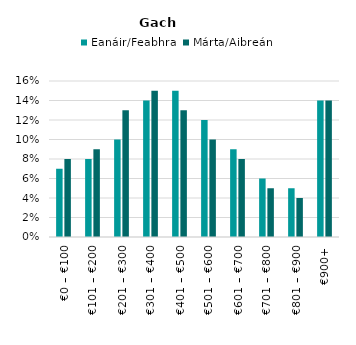
| Category | Eanáir/Feabhra | Márta/Aibreán |
|---|---|---|
| €0 – €100 | 0.07 | 0.08 |
| €101 – €200 | 0.08 | 0.09 |
| €201 – €300 | 0.1 | 0.13 |
| €301 – €400 | 0.14 | 0.15 |
| €401 – €500 | 0.15 | 0.13 |
| €501 – €600 | 0.12 | 0.1 |
| €601 – €700 | 0.09 | 0.08 |
| €701 – €800 | 0.06 | 0.05 |
| €801 – €900 | 0.05 | 0.04 |
| €900+ | 0.14 | 0.14 |